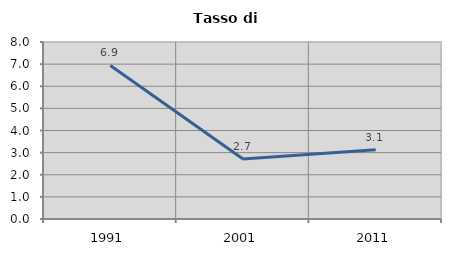
| Category | Tasso di disoccupazione   |
|---|---|
| 1991.0 | 6.942 |
| 2001.0 | 2.708 |
| 2011.0 | 3.131 |